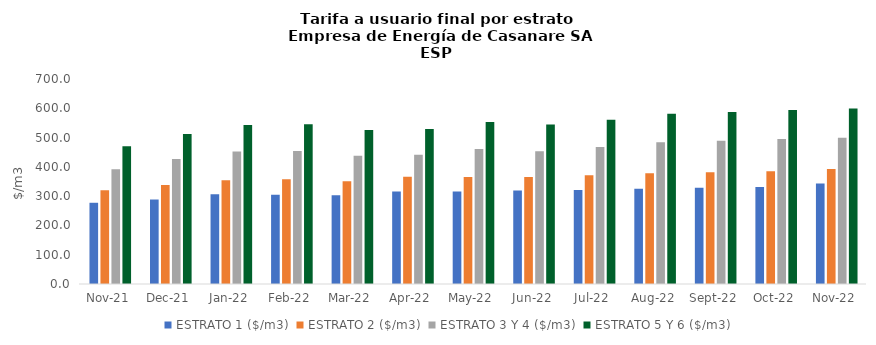
| Category | ESTRATO 1 ($/m3) | ESTRATO 2 ($/m3) | ESTRATO 3 Y 4 ($/m3) | ESTRATO 5 Y 6 ($/m3) |
|---|---|---|---|---|
| 2021-11-01 | 277.36 | 320.28 | 391.96 | 470.352 |
| 2021-12-01 | 288.49 | 338.1 | 426.54 | 511.848 |
| 2022-01-01 | 306.33 | 354.34 | 452.26 | 542.712 |
| 2022-02-01 | 305.06 | 357.43 | 454.22 | 545.064 |
| 2022-03-01 | 303.35 | 350.56 | 438.32 | 525.984 |
| 2022-04-01 | 315.74 | 365.83 | 441.08 | 529.296 |
| 2022-05-01 | 315.8 | 365.2 | 460.82 | 552.984 |
| 2022-06-01 | 319.19 | 365.21 | 453.71 | 544.452 |
| 2022-07-01 | 320.83 | 371.63 | 467.55 | 561.06 |
| 2022-08-01 | 325.09 | 378 | 484.31 | 581.172 |
| 2022-09-01 | 328.41 | 381.87 | 489.35 | 587.22 |
| 2022-10-01 | 331.46 | 385.42 | 495.2 | 594.24 |
| 2022-11-01 | 342.8 | 393 | 499.63 | 599.556 |